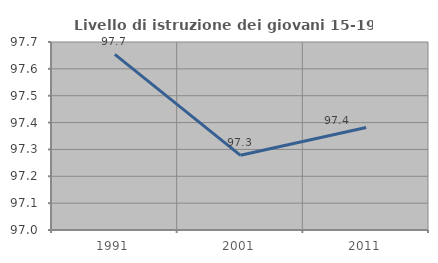
| Category | Livello di istruzione dei giovani 15-19 anni |
|---|---|
| 1991.0 | 97.654 |
| 2001.0 | 97.278 |
| 2011.0 | 97.382 |